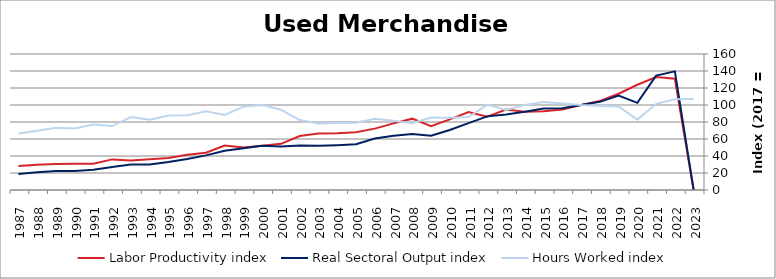
| Category | Labor Productivity index | Real Sectoral Output index | Hours Worked index |
|---|---|---|---|
| 2023.0 | 0 | 0 | 106.985 |
| 2022.0 | 130.848 | 139.535 | 106.638 |
| 2021.0 | 132.796 | 134.616 | 101.37 |
| 2020.0 | 123.8 | 102.485 | 82.783 |
| 2019.0 | 113.279 | 111.222 | 98.185 |
| 2018.0 | 104.839 | 103.715 | 98.928 |
| 2017.0 | 100 | 100 | 100 |
| 2016.0 | 94.588 | 96.256 | 101.764 |
| 2015.0 | 92.605 | 95.8 | 103.45 |
| 2014.0 | 91.999 | 92.1 | 100.11 |
| 2013.0 | 94.606 | 88.95 | 94.022 |
| 2012.0 | 86.178 | 86.635 | 100.53 |
| 2011.0 | 91.671 | 78.634 | 85.779 |
| 2010.0 | 83.139 | 70.556 | 84.865 |
| 2009.0 | 74.973 | 63.892 | 85.22 |
| 2008.0 | 83.925 | 66.019 | 78.664 |
| 2007.0 | 78.372 | 63.93 | 81.573 |
| 2006.0 | 72.18 | 60.51 | 83.831 |
| 2005.0 | 67.98 | 53.743 | 79.057 |
| 2004.0 | 66.872 | 52.732 | 78.855 |
| 2003.0 | 66.526 | 51.984 | 78.14 |
| 2002.0 | 63.475 | 52.228 | 82.28 |
| 2001.0 | 54.341 | 51.296 | 94.396 |
| 2000.0 | 52.104 | 52.081 | 99.956 |
| 1999.0 | 50.027 | 49.053 | 98.053 |
| 1998.0 | 52.421 | 46.288 | 88.301 |
| 1997.0 | 43.938 | 40.751 | 92.748 |
| 1996.0 | 41.58 | 36.54 | 87.878 |
| 1995.0 | 37.655 | 32.984 | 87.597 |
| 1994.0 | 36.291 | 29.992 | 82.643 |
| 1993.0 | 34.836 | 29.894 | 85.814 |
| 1992.0 | 36.012 | 27.099 | 75.251 |
| 1991.0 | 30.997 | 23.9 | 77.106 |
| 1990.0 | 30.969 | 22.38 | 72.268 |
| 1989.0 | 30.531 | 22.37 | 73.269 |
| 1988.0 | 29.777 | 20.796 | 69.838 |
| 1987.0 | 28.191 | 18.767 | 66.57 |